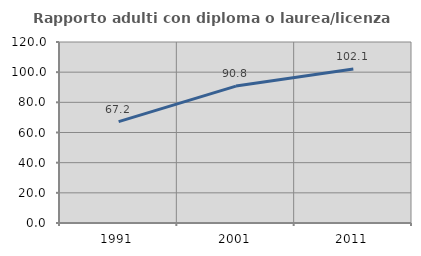
| Category | Rapporto adulti con diploma o laurea/licenza media  |
|---|---|
| 1991.0 | 67.241 |
| 2001.0 | 90.777 |
| 2011.0 | 102.083 |